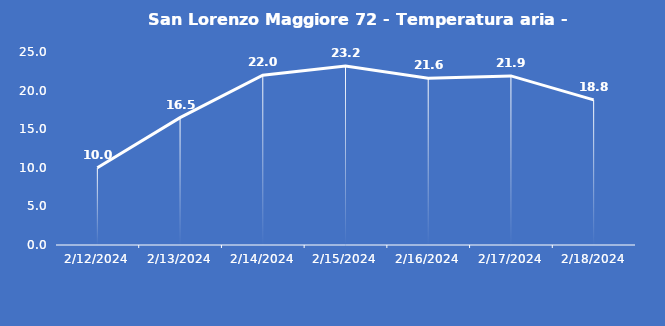
| Category | San Lorenzo Maggiore 72 - Temperatura aria - Grezzo (°C) |
|---|---|
| 2/12/24 | 10 |
| 2/13/24 | 16.5 |
| 2/14/24 | 22 |
| 2/15/24 | 23.2 |
| 2/16/24 | 21.6 |
| 2/17/24 | 21.9 |
| 2/18/24 | 18.8 |